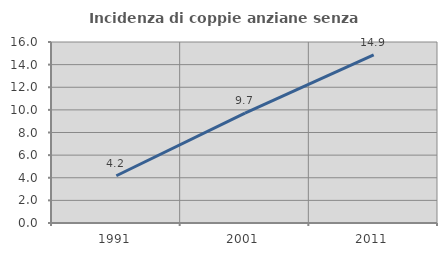
| Category | Incidenza di coppie anziane senza figli  |
|---|---|
| 1991.0 | 4.179 |
| 2001.0 | 9.714 |
| 2011.0 | 14.857 |